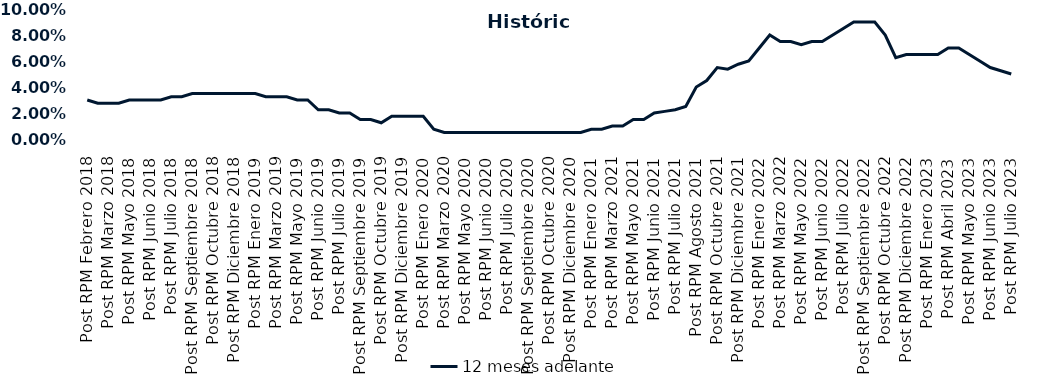
| Category | 12 meses adelante  |
|---|---|
| Post RPM Febrero 2018 | 0.03 |
| Pre RPM Marzo 2018 | 0.028 |
| Post RPM Marzo 2018 | 0.028 |
| Pre RPM Mayo 2018 | 0.028 |
| Post RPM Mayo 2018 | 0.03 |
| Pre RPM Junio 2018 | 0.03 |
| Post RPM Junio 2018 | 0.03 |
| Pre RPM Julio 2018 | 0.03 |
| Post RPM Julio 2018 | 0.032 |
| Pre RPM Septiembre 2018 | 0.032 |
| Post RPM Septiembre 2018 | 0.035 |
| Pre RPM Octubre 2018 | 0.035 |
| Post RPM Octubre 2018 | 0.035 |
| Pre RPM Diciembre 2018 | 0.035 |
| Post RPM Diciembre 2018 | 0.035 |
| Pre RPM Enero 2019 | 0.035 |
| Post RPM Enero 2019 | 0.035 |
| Pre RPM Marzo 2019 | 0.032 |
| Post RPM Marzo 2019 | 0.032 |
| Pre RPM Mayo 2019 | 0.032 |
| Post RPM Mayo 2019 | 0.03 |
| Pre RPM Junio 2019 | 0.03 |
| Post RPM Junio 2019 | 0.022 |
| Pre RPM Julio 2019 | 0.022 |
| Post RPM Julio 2019 | 0.02 |
| Pre RPM Septiembre 2019 | 0.02 |
| Post RPM Septiembre 2019 | 0.015 |
| Pre RPM Octubre 2019 | 0.015 |
| Post RPM Octubre 2019 | 0.012 |
| Pre RPM Diciembre 2019 | 0.018 |
| Post RPM Diciembre 2019 | 0.018 |
| Pre RPM Enero 2020 | 0.018 |
| Post RPM Enero 2020 | 0.018 |
| Pre RPM Marzo 2020 | 0.008 |
| Post RPM Marzo 2020 | 0.005 |
| Pre RPM Mayo 2020 | 0.005 |
| Post RPM Mayo 2020 | 0.005 |
| Pre RPM Junio 2020 | 0.005 |
| Post RPM Junio 2020 | 0.005 |
| Pre RPM Julio 2020 | 0.005 |
| Post RPM Julio 2020 | 0.005 |
| Pre RPM Septiembre 2020 | 0.005 |
| Post RPM Septiembre 2020 | 0.005 |
| Pre RPM Octubre 2020 | 0.005 |
| Post RPM Octubre 2020 | 0.005 |
| Pre RPM Diciembre 2020 | 0.005 |
| Post RPM Diciembre 2020 | 0.005 |
| Pre RPM Enero 2021 | 0.005 |
| Post RPM Enero 2021 | 0.008 |
| Pre RPM Marzo 2021 | 0.008 |
| Post RPM Marzo 2021 | 0.01 |
| Pre RPM Mayo 2021 | 0.01 |
| Post RPM Mayo 2021 | 0.015 |
| Pre RPM Junio 2021 | 0.015 |
| Post RPM Junio 2021 | 0.02 |
| Pre RPM Julio 2021 | 0.021 |
| Post RPM Julio 2021 | 0.022 |
| Pre RPM Agosto 2021 | 0.025 |
| Post RPM Agosto 2021 | 0.04 |
| Pre RPM Octubre 2021 | 0.045 |
| Post RPM Octubre 2021 | 0.055 |
| Pre RPM Diciembre 2021 | 0.054 |
| Post RPM Diciembre 2021 | 0.058 |
| Pre RPM Enero 2022 | 0.06 |
| Post RPM Enero 2022 | 0.07 |
| Pre RPM Marzo 2022 | 0.08 |
| Post RPM Marzo 2022 | 0.075 |
| Pre RPM Mayo 2022 | 0.075 |
| Post RPM Mayo 2022 | 0.072 |
| Pre RPM Junio 2022 | 0.075 |
| Post RPM Junio 2022 | 0.075 |
| Pre RPM Julio 2022 | 0.08 |
| Post RPM Julio 2022 | 0.085 |
| Pre RPM Septiembre 2022 | 0.09 |
| Post RPM Septiembre 2022 | 0.09 |
| Pre RPM Octubre 2022 | 0.09 |
| Post RPM Octubre 2022 | 0.08 |
| Pre RPM Diciembre 2022 | 0.062 |
| Post RPM Diciembre 2022 | 0.065 |
| Pre RPM Enero 2023 | 0.065 |
| Post RPM Enero 2023 | 0.065 |
| Pre RPM Abril 2023 | 0.065 |
| Post RPM Abril 2023 | 0.07 |
| Pre RPM Mayo 2023 | 0.07 |
| Post RPM Mayo 2023 | 0.065 |
| Pre RPM Junio 2023 | 0.06 |
| Post RPM Junio 2023 | 0.055 |
| Pre RPM Julio 2023 | 0.052 |
| Post RPM Julio 2023 | 0.05 |